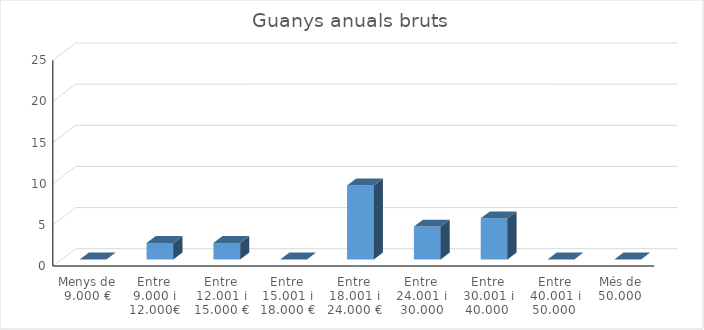
| Category | Series 0 |
|---|---|
| Menys de 9.000 € | 0 |
| Entre 9.000 i 12.000€ | 2 |
| Entre 12.001 i 15.000 € | 2 |
| Entre 15.001 i 18.000 € | 0 |
| Entre 18.001 i 24.000 € | 9 |
| Entre 24.001 i 30.000 | 4 |
| Entre 30.001 i 40.000  | 5 |
| Entre 40.001 i 50.000  | 0 |
| Més de 50.000  | 0 |